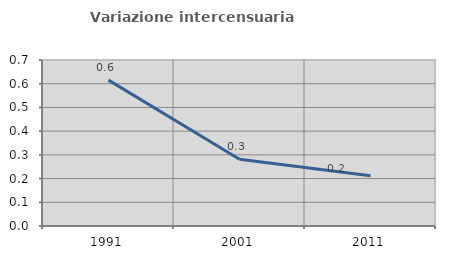
| Category | Variazione intercensuaria annua |
|---|---|
| 1991.0 | 0.615 |
| 2001.0 | 0.282 |
| 2011.0 | 0.212 |